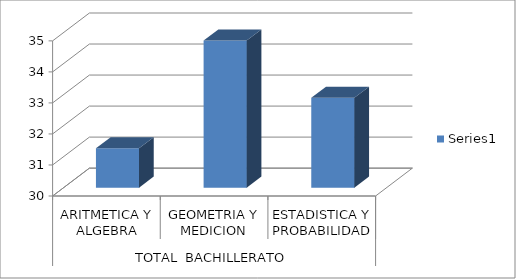
| Category | Series 0 |
|---|---|
| 0 | 31.267 |
| 1 | 34.739 |
| 2 | 32.893 |